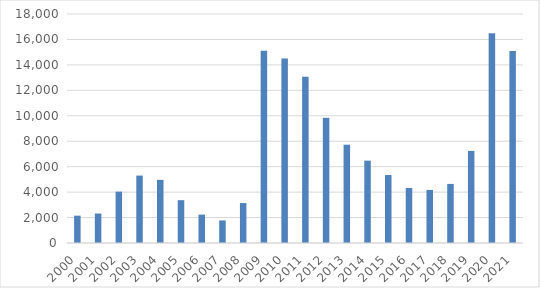
| Category | Series 0 |
|---|---|
| 2000.0 | 2149 |
| 2001.0 | 2319 |
| 2002.0 | 4037 |
| 2003.0 | 5299 |
| 2004.0 | 4962 |
| 2005.0 | 3366 |
| 2006.0 | 2231 |
| 2007.0 | 1774 |
| 2008.0 | 3139 |
| 2009.0 | 15121 |
| 2010.0 | 14503 |
| 2011.0 | 13066 |
| 2012.0 | 9838 |
| 2013.0 | 7726 |
| 2014.0 | 6474 |
| 2015.0 | 5342 |
| 2016.0 | 4324 |
| 2017.0 | 4171 |
| 2018.0 | 4643 |
| 2019.0 | 7238 |
| 2020.0 | 16496.333 |
| 2021.0 | 15082 |